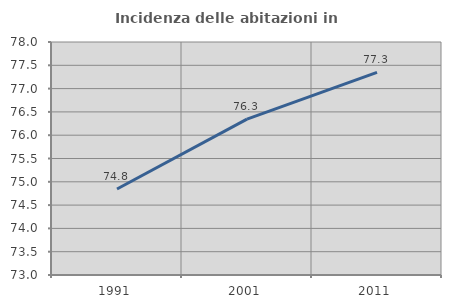
| Category | Incidenza delle abitazioni in proprietà  |
|---|---|
| 1991.0 | 74.847 |
| 2001.0 | 76.344 |
| 2011.0 | 77.348 |